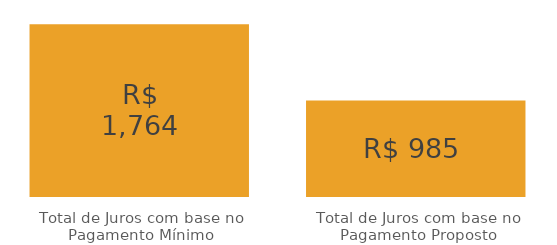
| Category | Series 0 |
|---|---|
| Total de Juros com base no Pagamento Mínimo | 1763.952 |
| Total de Juros com base no Pagamento Proposto | 984.811 |